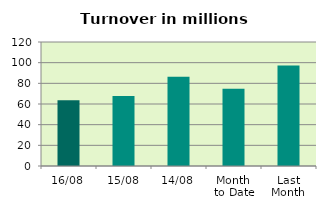
| Category | Series 0 |
|---|---|
| 16/08 | 63.613 |
| 15/08 | 67.71 |
| 14/08 | 86.282 |
| Month 
to Date | 74.832 |
| Last
Month | 97.283 |